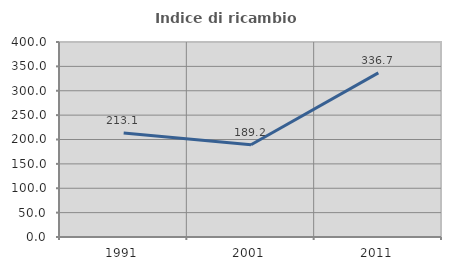
| Category | Indice di ricambio occupazionale  |
|---|---|
| 1991.0 | 213.115 |
| 2001.0 | 189.231 |
| 2011.0 | 336.667 |